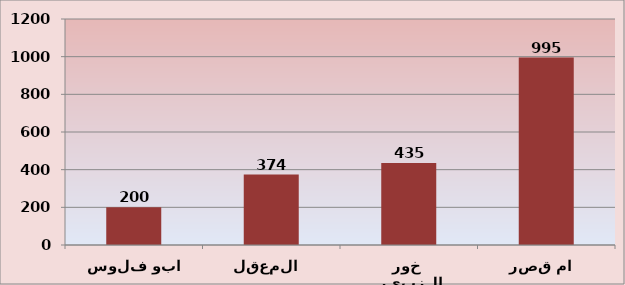
| Category | Series 0 |
|---|---|
| ابو فلوس | 200 |
| المعقل  | 374 |
| خور الزبير  | 435 |
| ام قصر  | 995 |